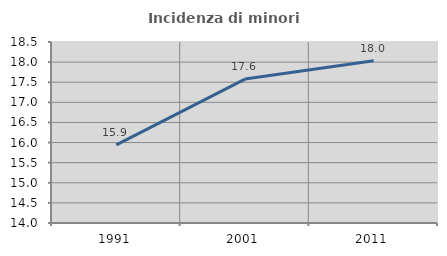
| Category | Incidenza di minori stranieri |
|---|---|
| 1991.0 | 15.942 |
| 2001.0 | 17.578 |
| 2011.0 | 18.034 |